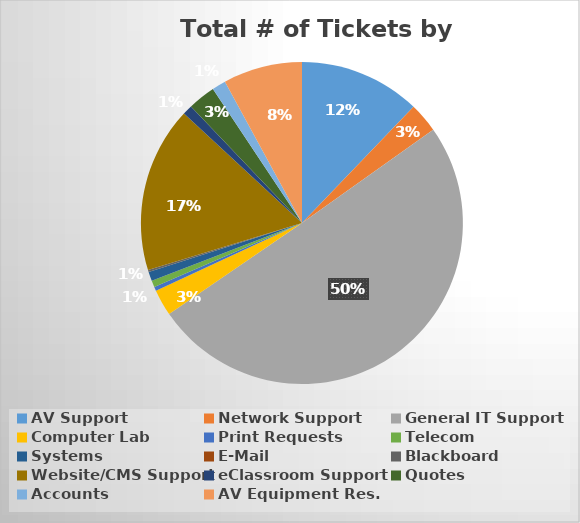
| Category | Series 0 |
|---|---|
| AV Support | 0.122 |
| Network Support | 0.03 |
| General IT Support | 0.503 |
| Computer Lab | 0.026 |
| Print Requests | 0.004 |
| Telecom | 0.007 |
| Systems | 0.009 |
| E-Mail | 0 |
| Blackboard | 0.002 |
| Website/CMS Support | 0.166 |
| eClassroom Support | 0.01 |
| Quotes | 0.028 |
| Accounts | 0.014 |
| AV Equipment Res. | 0.079 |